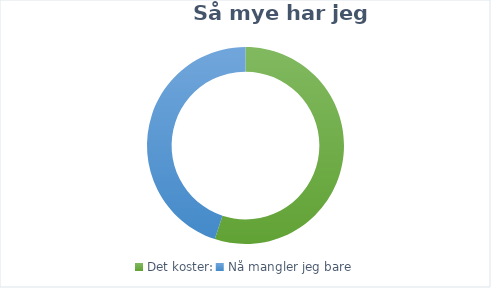
| Category | Series 0 |
|---|---|
| Det koster: | 3000 |
| Nå mangler jeg bare | 2450 |